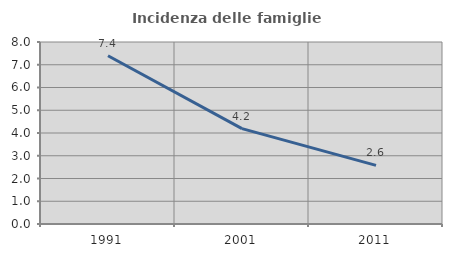
| Category | Incidenza delle famiglie numerose |
|---|---|
| 1991.0 | 7.395 |
| 2001.0 | 4.192 |
| 2011.0 | 2.577 |